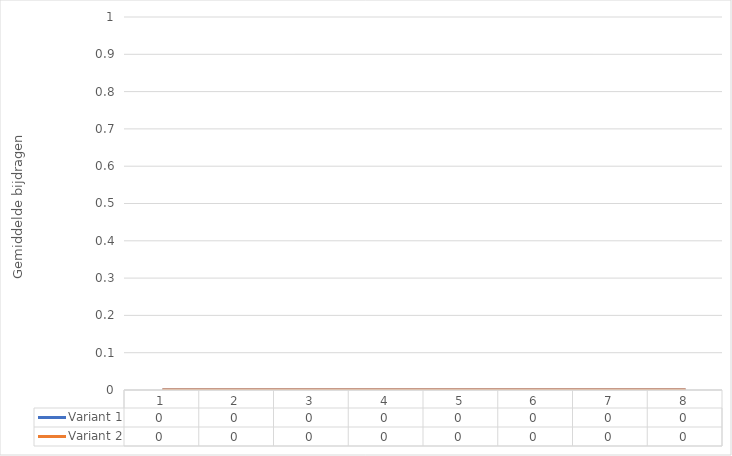
| Category | Variant 1 | Variant 2 |
|---|---|---|
| 1.0 | 0 | 0 |
| 2.0 | 0 | 0 |
| 3.0 | 0 | 0 |
| 4.0 | 0 | 0 |
| 5.0 | 0 | 0 |
| 6.0 | 0 | 0 |
| 7.0 | 0 | 0 |
| 8.0 | 0 | 0 |